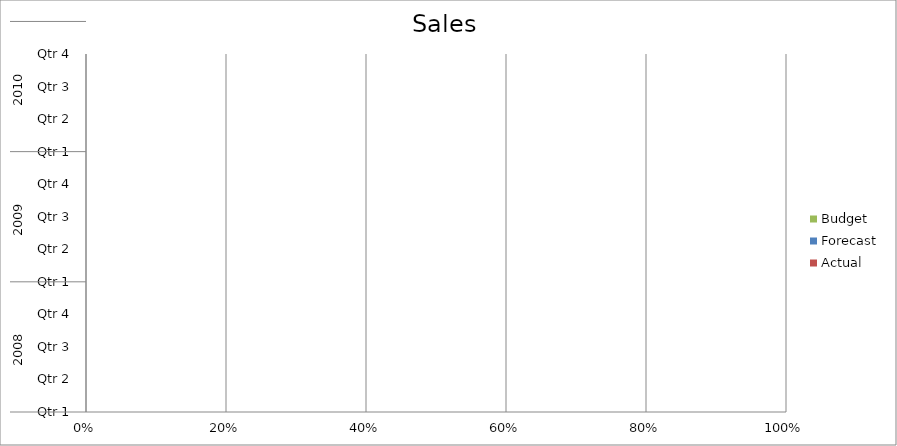
| Category | Budget | Forecast | Actual |
|---|---|---|---|
| 0 | 740 | 2670 | 2310 |
| 1 | 3040 | 2210 | 3490 |
| 2 | 660 | 1680 | 810 |
| 3 | 2630 | 1860 | 2820 |
| 4 | 3390 | 1690 | 3370 |
| 5 | 2750 | 1430 | 840 |
| 6 | 3200 | 1450 | 3490 |
| 7 | 1060 | 2440 | 740 |
| 8 | 3250 | 3090 | 2990 |
| 9 | 3080 | 1720 | 1660 |
| 10 | 1230 | 650 | 1680 |
| 11 | 1630 | 1480 | 1820 |